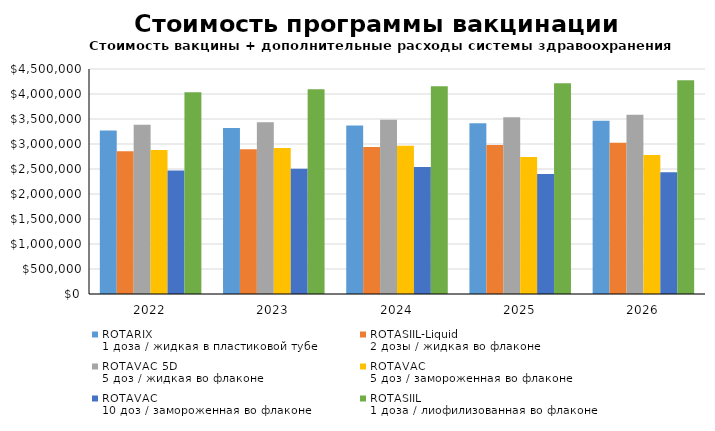
| Category | ROTARIX
1 доза / жидкая в пластиковой тубе | ROTASIIL-Liquid
2 дозы / жидкая во флаконе | ROTAVAC 5D
5 доз / жидкая во флаконе | ROTAVAC
5 доз / замороженная во флаконе | ROTAVAC
10 доз / замороженная во флаконе | ROTASIIL
1 доза / лиофилизованная во флаконе |
|---|---|---|---|---|---|---|
| 2022.0 | 3272179.167 | 2854421.538 | 3386128.421 | 2879475.789 | 2468045.106 | 4034397.5 |
| 2023.0 | 3319745.868 | 2895915.421 | 3435351.569 | 2921333.878 | 2503922.349 | 4093044.344 |
| 2024.0 | 3368004.032 | 2938012.487 | 3485290.259 | 2963800.445 | 2540321.128 | 4152543.72 |
| 2025.0 | 3416963.712 | 2980721.506 | 3535954.894 | 2742349.057 | 2399016.036 | 4212908.02 |
| 2026.0 | 3466635.103 | 3024051.374 | 3587356.025 | 2782213.775 | 2433889.823 | 4274149.819 |